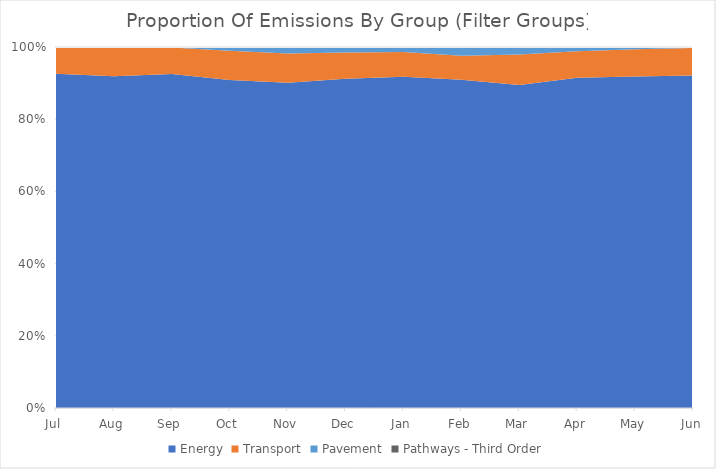
| Category | Energy | Transport | Pavement | Pathways - Third Order |
|---|---|---|---|---|
| Jul | 3739475.92 | 295843.133 | 4198.11 | 170.31 |
| Aug | 3689571.545 | 319998.625 | 5079 | 1483 |
| Sep | 3714832.63 | 294915.596 | 4022 | 1526 |
| Oct | 3731551.888 | 333237.089 | 36571 | 6950 |
| Nov | 3729217.409 | 337195.329 | 67310 | 5793 |
| Dec | 3712976.42 | 296564.337 | 58669 | 1950 |
| Jan | 3730426.992 | 278044.453 | 52048 | 4700 |
| Feb | 3703645.334 | 271372.331 | 90453 | 8155 |
| Mar | 3704032.977 | 348712.223 | 78732 | 7946 |
| Apr | 3691423.752 | 295271.242 | 44659 | 4242 |
| May | 3689514.682 | 304919.352 | 21831.928 | 1981.616 |
| Jun | 3683762.482 | 302613.412 | 10915.964 | 990.808 |